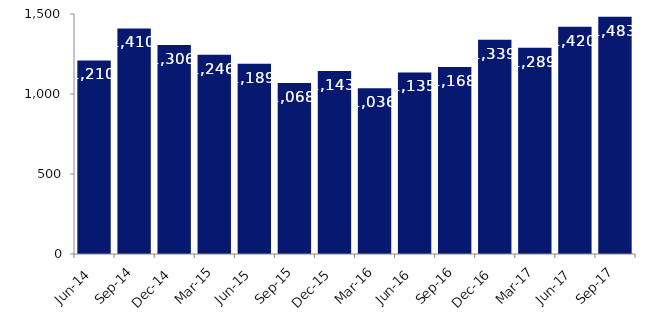
| Category | Series 0 |
|---|---|
| Jun-14 | 1210 |
| Sep-14 | 1410 |
| Dec-14 | 1306 |
| Mar-15 | 1246 |
| Jun-15 | 1189 |
| Sep-15 | 1068 |
| Dec-15 | 1143 |
| Mar-16 | 1036 |
| Jun-16 | 1135 |
| Sep-16 | 1168 |
| Dec-16 | 1339 |
| Mar-17 | 1289 |
| Jun-17 | 1420 |
| Sep-17 | 1483 |